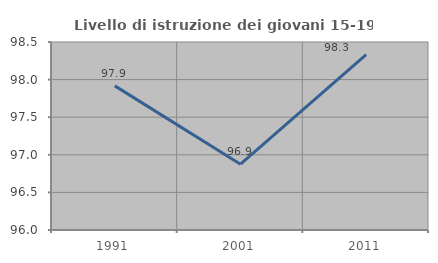
| Category | Livello di istruzione dei giovani 15-19 anni |
|---|---|
| 1991.0 | 97.917 |
| 2001.0 | 96.875 |
| 2011.0 | 98.333 |